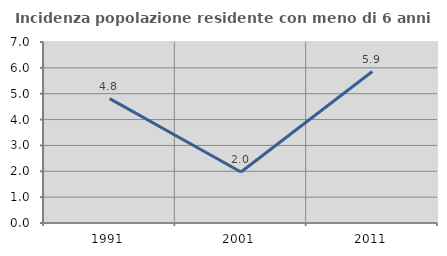
| Category | Incidenza popolazione residente con meno di 6 anni |
|---|---|
| 1991.0 | 4.81 |
| 2001.0 | 1.974 |
| 2011.0 | 5.857 |